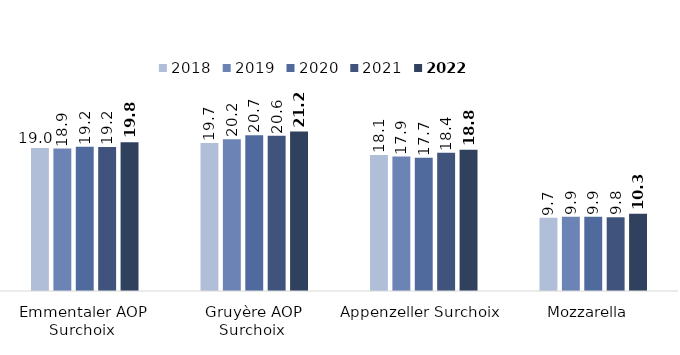
| Category | 2018 | 2019 | 2020 | 2021 | 2022 |
|---|---|---|---|---|---|
| Emmentaler AOP Surchoix  | 19.027 | 18.94 | 19.186 | 19.151 | 19.768 |
| Gruyère AOP Surchoix  | 19.684 | 20.175 | 20.727 | 20.644 | 21.198 |
| Appenzeller Surchoix  | 18.08 | 17.874 | 17.714 | 18.375 | 18.768 |
| Mozzarella  | 9.727 | 9.869 | 9.874 | 9.814 | 10.267 |